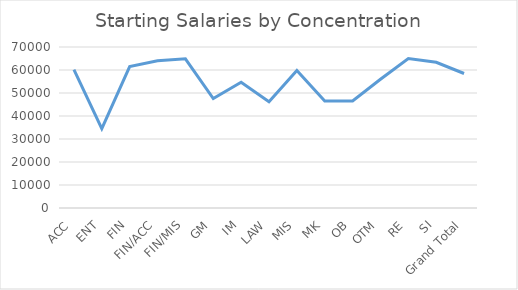
| Category | Series 0 |
|---|---|
| ACC | 60130.435 |
| ENT | 34500 |
| FIN | 61497.538 |
| FIN/ACC | 63978.723 |
| FIN/MIS | 64838.16 |
| GM | 47583.333 |
| IM | 54681.818 |
| LAW | 46187.5 |
| MIS | 59750 |
| MK | 46541.463 |
| OB | 46566.667 |
| OTM | 55979.231 |
| RE | 65000 |
| SI | 63333.333 |
| Grand Total | 58482.031 |